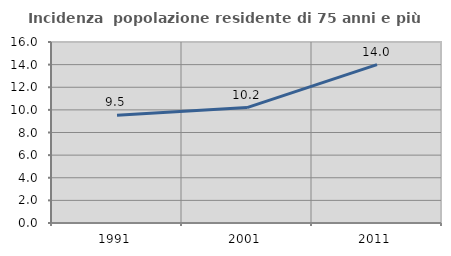
| Category | Incidenza  popolazione residente di 75 anni e più |
|---|---|
| 1991.0 | 9.516 |
| 2001.0 | 10.204 |
| 2011.0 | 14.006 |